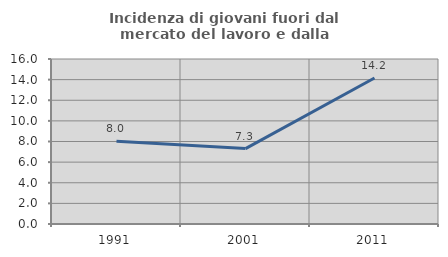
| Category | Incidenza di giovani fuori dal mercato del lavoro e dalla formazione  |
|---|---|
| 1991.0 | 8.036 |
| 2001.0 | 7.315 |
| 2011.0 | 14.156 |